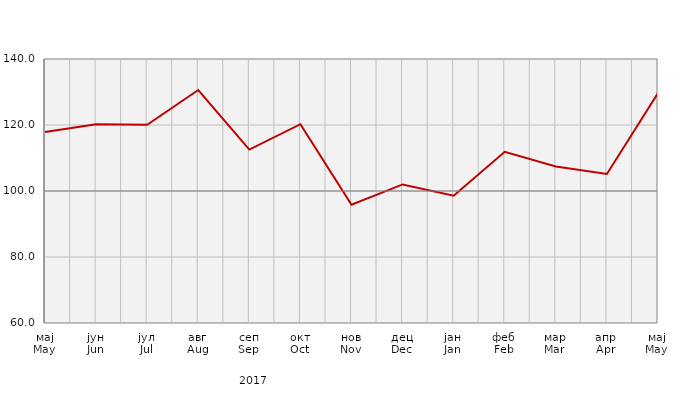
| Category | Индекси ноћења туриста
Tourist night indices |
|---|---|
| мај
May | 117.906 |
| јун
Jun | 120.259 |
| јул
Jul | 120.08 |
| авг
Aug | 130.596 |
| сеп
Sep | 112.544 |
| окт
Oct | 120.238 |
| нов
Nov | 95.857 |
| дец
Dec | 101.993 |
| јан
Jan | 98.549 |
| феб
Feb | 111.894 |
| мар
Mar | 107.417 |
| апр
Apr | 105.153 |
| мај
May | 129.708 |